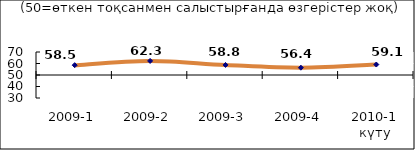
| Category | Диф.индекс ↓ |
|---|---|
| 2009-1 | 58.535 |
| 2009-2 | 62.255 |
| 2009-3 | 58.75 |
| 2009-4 | 56.36 |
| 2010-1 күту | 59.095 |